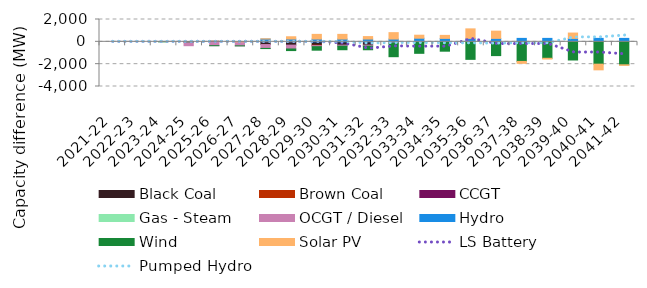
| Category | Black Coal | Brown Coal | CCGT | Gas - Steam | OCGT / Diesel | Hydro | Wind | Solar PV |
|---|---|---|---|---|---|---|---|---|
| 2021-22 | 0 | 0 | 0 | 0 | 0 | 0 | 0 | 0 |
| 2022-23 | 0 | 0 | 0 | 0 | 0 | 0 | 0 | 0 |
| 2023-24 | 0 | 0 | 0 | 0 | 0 | 0 | 0 | 0 |
| 2024-25 | -0.02 | 1.835 | 0 | 0 | -345.263 | 0 | 0 | 0 |
| 2025-26 | 42.872 | 1.835 | 0 | 0 | -345.263 | 0 | -0.328 | 0 |
| 2026-27 | -15.208 | 1.835 | 0 | 0 | -345.263 | 0 | -0.328 | 0 |
| 2027-28 | -244.35 | 1.835 | 0 | 0 | -345.263 | 250 | -13.064 | 18.363 |
| 2028-29 | -294.99 | 1.835 | 0 | 0 | -345.263 | 250 | -143.099 | 202.433 |
| 2029-30 | -293.167 | -44.772 | 0 | 0 | -95.892 | 250 | -313.532 | 418.041 |
| 2030-31 | -293.167 | 0 | 0 | 0 | -95.892 | 250 | -317.704 | 418.041 |
| 2031-32 | -293.167 | 0 | 0 | 0 | -95.892 | 250 | -320.409 | 219.992 |
| 2032-33 | -12.572 | 0 | 0 | 0 | -95.892 | 250 | -1222.772 | 572.722 |
| 2033-34 | -12.572 | 0 | 0 | 0 | 74.108 | 250 | -1016.136 | 269.259 |
| 2034-35 | -12.572 | 0 | 0 | 0 | 57.999 | 250 | -825.454 | 269.259 |
| 2035-36 | 0 | 0 | 0 | 0 | 57.999 | 250 | -1568.997 | 853.197 |
| 2036-37 | 0 | 0 | 0 | 0 | 57.999 | 250 | -1233.135 | 648.542 |
| 2037-38 | 0 | 0 | 0 | 0 | 57.999 | 250 | -1754.307 | -169.595 |
| 2038-39 | 0 | 0 | 0 | 0 | 57.999 | 250 | -1472.887 | -66.506 |
| 2039-40 | 0 | 0 | 0 | 0 | 57.999 | 250 | -1625.77 | 477.969 |
| 2040-41 | 0 | 0 | 0 | 0 | 57.999 | 250 | -1999.42 | -508.488 |
| 2041-42 | 0 | 0 | 0 | 0 | 57.999 | 250 | -2058.368 | -48.508 |